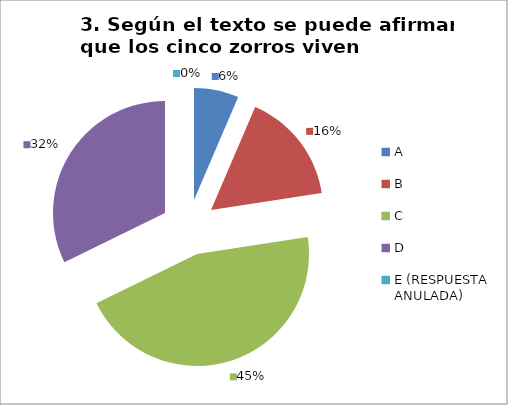
| Category | CANTIDAD DE RESPUESTAS PREGUNTA (3) | PORCENTAJE |
|---|---|---|
| A | 2 | 0.065 |
| B | 5 | 0.161 |
| C | 14 | 0.452 |
| D | 10 | 0.323 |
| E (RESPUESTA ANULADA) | 0 | 0 |